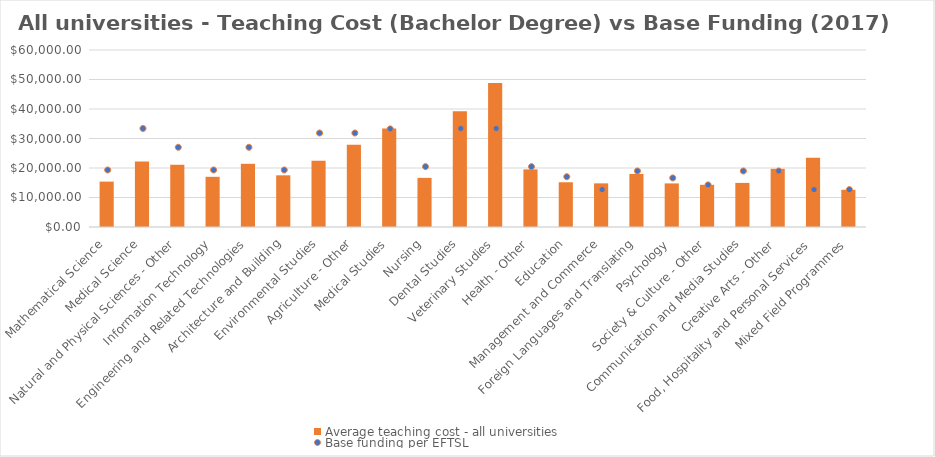
| Category | Average teaching cost - all universities  |
|---|---|
| Mathematical Science | 15385.861 |
| Medical Science | 22199.845 |
| Natural and Physical Sciences - Other | 21101.134 |
| Information Technology | 17015.288 |
| Engineering and Related Technologies | 21424.913 |
| Architecture and Building | 17520.625 |
| Environmental Studies | 22483.102 |
| Agriculture - Other | 27841.632 |
| Medical Studies | 33374.444 |
| Nursing | 16655.946 |
| Dental Studies | 39204.331 |
| Veterinary Studies | 48777.792 |
| Health - Other | 19526.952 |
| Education | 15163.582 |
| Management and Commerce | 14793.183 |
| Foreign Languages and Translating | 17988.506 |
| Psychology | 14777.949 |
| Society & Culture - Other | 14294.051 |
| Communication and Media Studies | 14949.033 |
| Creative Arts - Other | 19725.498 |
| Food, Hospitality and Personal Services | 23480.081 |
| Mixed Field Programmes | 12618.402 |